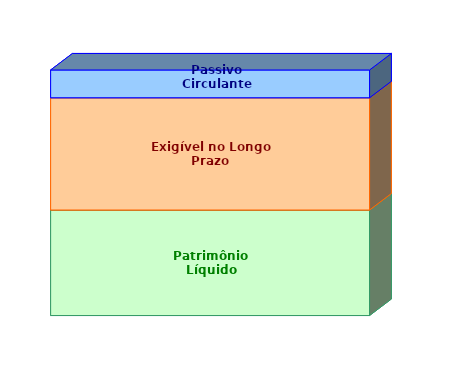
| Category | Patrimônio Líquido | Exigível no Longo Prazo | Passivo Circulante |
|---|---|---|---|
| 0 | 0.43 | 0.457 | 0.113 |